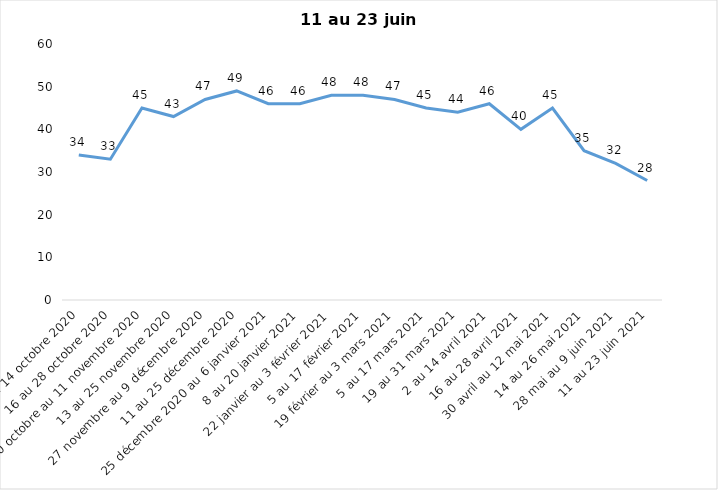
| Category | Toujours aux trois mesures |
|---|---|
| 2 au 14 octobre 2020 | 34 |
| 16 au 28 octobre 2020 | 33 |
| 30 octobre au 11 novembre 2020 | 45 |
| 13 au 25 novembre 2020 | 43 |
| 27 novembre au 9 décembre 2020 | 47 |
| 11 au 25 décembre 2020 | 49 |
| 25 décembre 2020 au 6 janvier 2021 | 46 |
| 8 au 20 janvier 2021 | 46 |
| 22 janvier au 3 février 2021 | 48 |
| 5 au 17 février 2021 | 48 |
| 19 février au 3 mars 2021 | 47 |
| 5 au 17 mars 2021 | 45 |
| 19 au 31 mars 2021 | 44 |
| 2 au 14 avril 2021 | 46 |
| 16 au 28 avril 2021 | 40 |
| 30 avril au 12 mai 2021 | 45 |
| 14 au 26 mai 2021 | 35 |
| 28 mai au 9 juin 2021 | 32 |
| 11 au 23 juin 2021 | 28 |